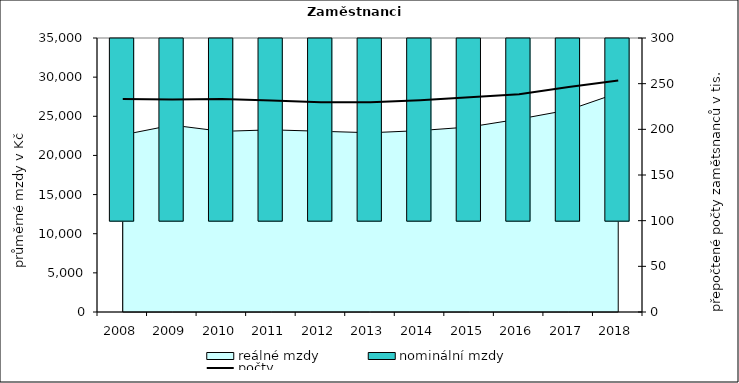
| Category | nominální mzdy  |
|---|---|
| 2008.0 | 20519.082 |
| 2009.0 | 21890.625 |
| 2010.0 | 21457.948 |
| 2011.0 | 22059.453 |
| 2012.0 | 22600.393 |
| 2013.0 | 22736.16 |
| 2014.0 | 23105.299 |
| 2015.0 | 23637.347 |
| 2016.0 | 24814.03 |
| 2017.0 | 26608.582 |
| 2018.0 | 29476 |